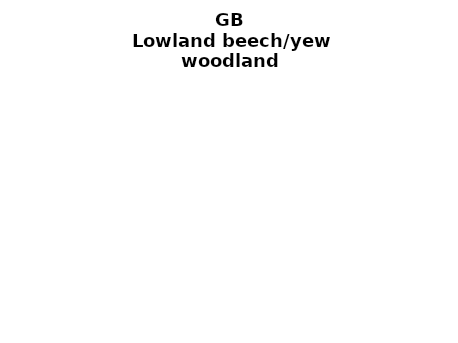
| Category | Lowland beech/yew woodland |
|---|---|
|  ≥ 10ha, < 10%  | 0.456 |
|   ≥ 10ha, 10-25% | 0.11 |
|   ≥ 10ha, > 25 and <50%  | 0.084 |
|   ≥ 10ha, ≥ 50%  | 0.135 |
|  < 10ha, < 10% | 0.044 |
|  < 10ha, 10-25% | 0.013 |
|  < 10ha, > 25 and < 50% | 0.029 |
|  < 10ha, ≥ 50% | 0.129 |